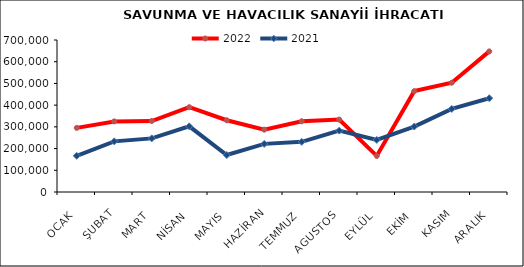
| Category | 2022 | 2021 |
|---|---|---|
| OCAK | 295374.955 | 166540.168 |
| ŞUBAT | 325086.209 | 233224.164 |
| MART | 326942.177 | 246958.497 |
| NİSAN | 390536.098 | 302467.594 |
| MAYIS | 330387.684 | 170344.528 |
| HAZİRAN | 286912.792 | 221630.073 |
| TEMMUZ | 325740.567 | 230940.866 |
| AGUSTOS | 333540.524 | 282567.086 |
| EYLÜL | 166231.577 | 239695.277 |
| EKİM | 464526.749 | 301391.63 |
| KASIM | 503261.418 | 382521.115 |
| ARALIK | 647456.328 | 431860.107 |